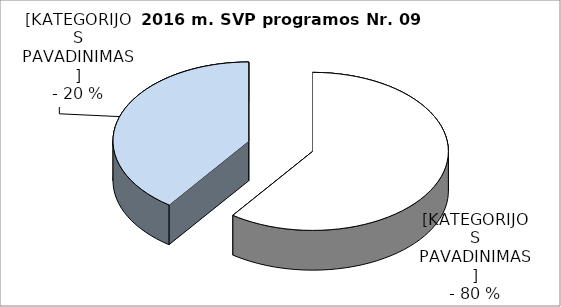
| Category | Series 0 |
|---|---|
| faktiškai įvykdyta | 3 |
| iš dalies įvykdyta | 2 |